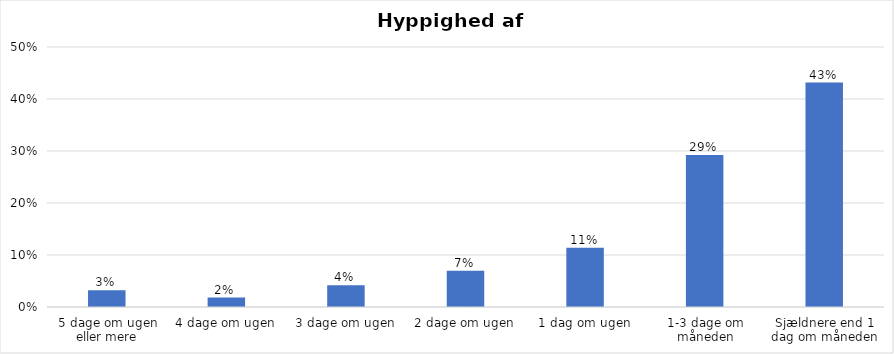
| Category | % |
|---|---|
| 5 dage om ugen eller mere | 0.032 |
| 4 dage om ugen | 0.018 |
| 3 dage om ugen | 0.042 |
| 2 dage om ugen | 0.07 |
| 1 dag om ugen | 0.114 |
| 1-3 dage om måneden | 0.292 |
| Sjældnere end 1 dag om måneden | 0.432 |